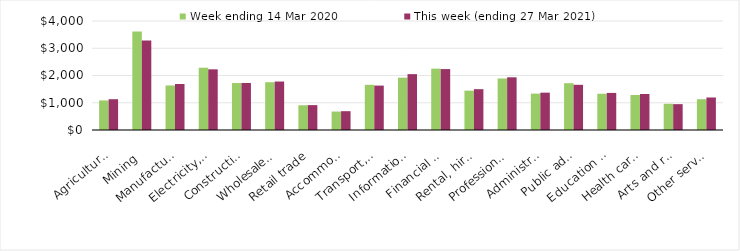
| Category | Week ending 14 Mar 2020 | This week (ending 27 Mar 2021) |
|---|---|---|
| Agriculture, forestry and fishing | 1084.37 | 1130.22 |
| Mining | 3610.72 | 3288.2 |
| Manufacturing | 1633.67 | 1687.15 |
| Electricity, gas, water and waste services | 2285.38 | 2226.66 |
| Construction | 1723.08 | 1726.26 |
| Wholesale trade | 1753.36 | 1779.05 |
| Retail trade | 908.87 | 912.91 |
| Accommodation and food services | 677.37 | 690.85 |
| Transport, postal and warehousing | 1657.68 | 1629.58 |
| Information media and telecommunications | 1920.64 | 2049.87 |
| Financial and insurance services | 2251.65 | 2235.79 |
| Rental, hiring and real estate services | 1443.84 | 1498.28 |
| Professional, scientific and technical services | 1890 | 1933.62 |
| Administrative and support services | 1335.48 | 1370.45 |
| Public administration and safety | 1717.51 | 1657.85 |
| Education and training | 1330.97 | 1360.16 |
| Health care and social assistance | 1283.7 | 1320.2 |
| Arts and recreation services | 962.62 | 948.85 |
| Other services | 1129.79 | 1193.11 |